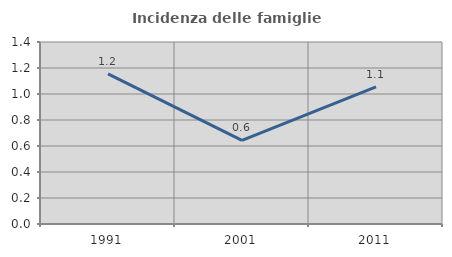
| Category | Incidenza delle famiglie numerose |
|---|---|
| 1991.0 | 1.154 |
| 2001.0 | 0.643 |
| 2011.0 | 1.055 |